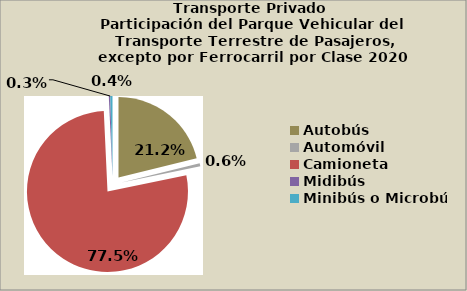
| Category | Series 0 |
|---|---|
| Autobús | 21.161 |
| Automóvil | 0.589 |
| Camioneta | 77.514 |
| Midibús | 0.294 |
| Minibús o Microbús | 0.442 |